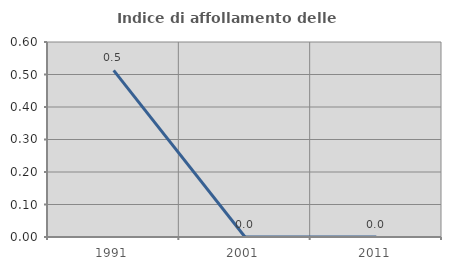
| Category | Indice di affollamento delle abitazioni  |
|---|---|
| 1991.0 | 0.513 |
| 2001.0 | 0 |
| 2011.0 | 0 |